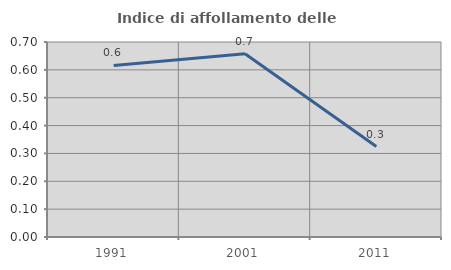
| Category | Indice di affollamento delle abitazioni  |
|---|---|
| 1991.0 | 0.616 |
| 2001.0 | 0.658 |
| 2011.0 | 0.325 |